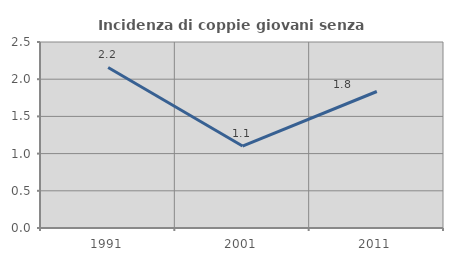
| Category | Incidenza di coppie giovani senza figli |
|---|---|
| 1991.0 | 2.158 |
| 2001.0 | 1.102 |
| 2011.0 | 1.835 |